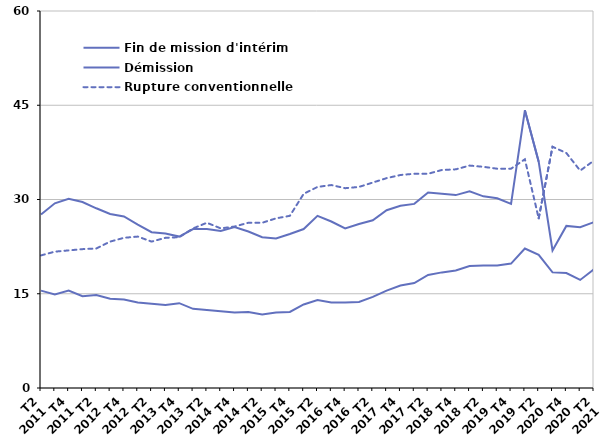
| Category | Fin de mission d'intérim | Démission | Rupture conventionnelle |
|---|---|---|---|
| T2
2011 | 27.6 | 15.5 | 21.1 |
| T3
2011 | 29.4 | 14.9 | 21.7 |
| T4
2011 | 30.1 | 15.5 | 21.9 |
| T1
2012 | 29.6 | 14.6 | 22.1 |
| T2
2012 | 28.6 | 14.8 | 22.2 |
| T3
2012 | 27.7 | 14.2 | 23.3 |
| T4
2012 | 27.3 | 14.1 | 23.9 |
| T1
2013 | 26 | 13.6 | 24.1 |
| T2
2013 | 24.8 | 13.4 | 23.3 |
| T3
2013 | 24.6 | 13.2 | 23.9 |
| T4
2013 | 24.1 | 13.5 | 24 |
| T1
2014 | 25.3 | 12.6 | 25.4 |
| T2
2014 | 25.3 | 12.4 | 26.3 |
| T3
2014 | 25 | 12.2 | 25.4 |
| T4
2014 | 25.6 | 12 | 25.7 |
| T1
2015 | 24.9 | 12.1 | 26.3 |
| T2
2015 | 24 | 11.7 | 26.3 |
| T3
2015 | 23.8 | 12 | 27 |
| T4
2015 | 24.5 | 12.1 | 27.4 |
| T1
2016 | 25.3 | 13.3 | 30.9 |
| T2
2016 | 27.4 | 14 | 32 |
| T3
2016 | 26.5 | 13.6 | 32.3 |
| T4
2016 | 25.4 | 13.6 | 31.8 |
| T1
2017 | 26.1 | 13.7 | 32 |
| T2
2017 | 26.7 | 14.5 | 32.7 |
| T3
2017 | 28.3 | 15.5 | 33.4 |
| T4
2017 | 29 | 16.3 | 33.9 |
| T1
2018 | 29.3 | 16.7 | 34.1 |
| T2
2018 | 31.1 | 18 | 34.1 |
| T3
2018 | 30.9 | 18.4 | 34.7 |
| T4
2018 | 30.7 | 18.7 | 34.8 |
| T1
2019 | 31.3 | 19.4 | 35.4 |
| T2
2019 | 30.5 | 19.5 | 35.2 |
| T3
2019 | 30.2 | 19.5 | 34.9 |
| T4
2019 | 29.3 | 19.8 | 34.9 |
| T1
2020 | 44.2 | 22.2 | 36.4 |
| T2
2020 | 36 | 21.2 | 27 |
| T3
2020 | 21.9 | 18.4 | 38.4 |
| T4
2020 | 25.8 | 18.3 | 37.4 |
| T1
2021 | 25.6 | 17.2 | 34.6 |
| T2
2021 | 26.4 | 18.9 | 36.2 |